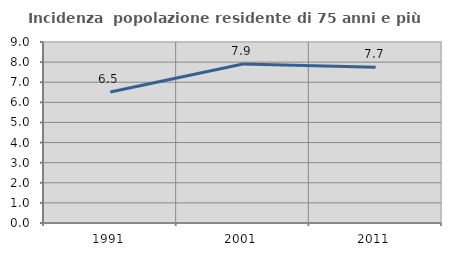
| Category | Incidenza  popolazione residente di 75 anni e più |
|---|---|
| 1991.0 | 6.513 |
| 2001.0 | 7.909 |
| 2011.0 | 7.744 |